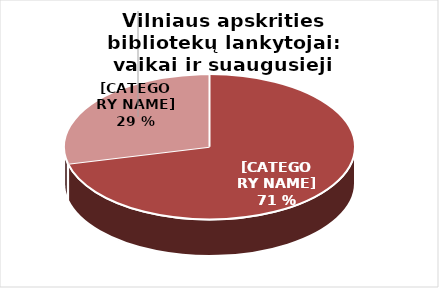
| Category | Series 0 |
|---|---|
| Suaugusieji | 916227 |